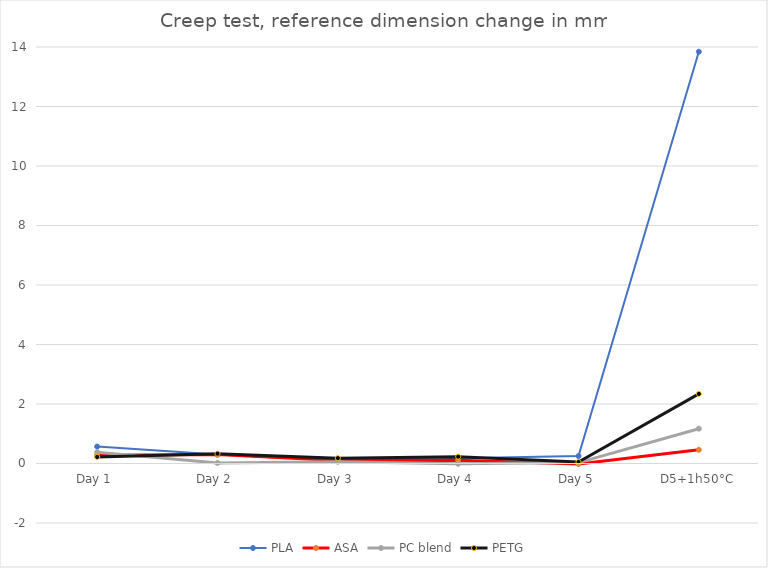
| Category | PLA | ASA | PC blend | PETG |
|---|---|---|---|---|
| Day 1 | 0.57 | 0.28 | 0.38 | 0.22 |
| Day 2 | 0.3 | 0.3 | 0.02 | 0.33 |
| Day 3 | 0.11 | 0.1 | 0.06 | 0.18 |
| Day 4 | 0.18 | 0.11 | -0.01 | 0.23 |
| Day 5 | 0.25 | -0.02 | 0.03 | 0.05 |
| D5+1h50°C | 13.84 | 0.46 | 1.17 | 2.34 |